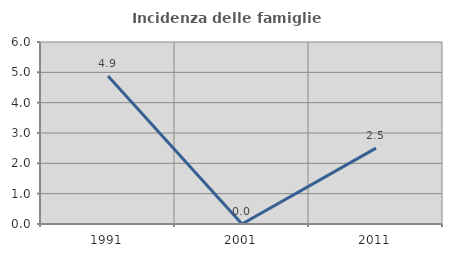
| Category | Incidenza delle famiglie numerose |
|---|---|
| 1991.0 | 4.878 |
| 2001.0 | 0 |
| 2011.0 | 2.5 |